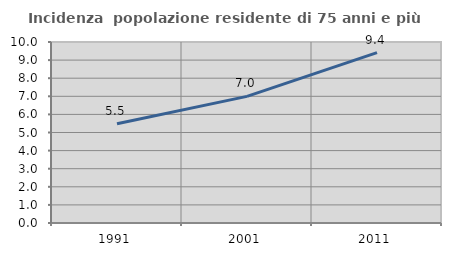
| Category | Incidenza  popolazione residente di 75 anni e più |
|---|---|
| 1991.0 | 5.48 |
| 2001.0 | 6.997 |
| 2011.0 | 9.414 |